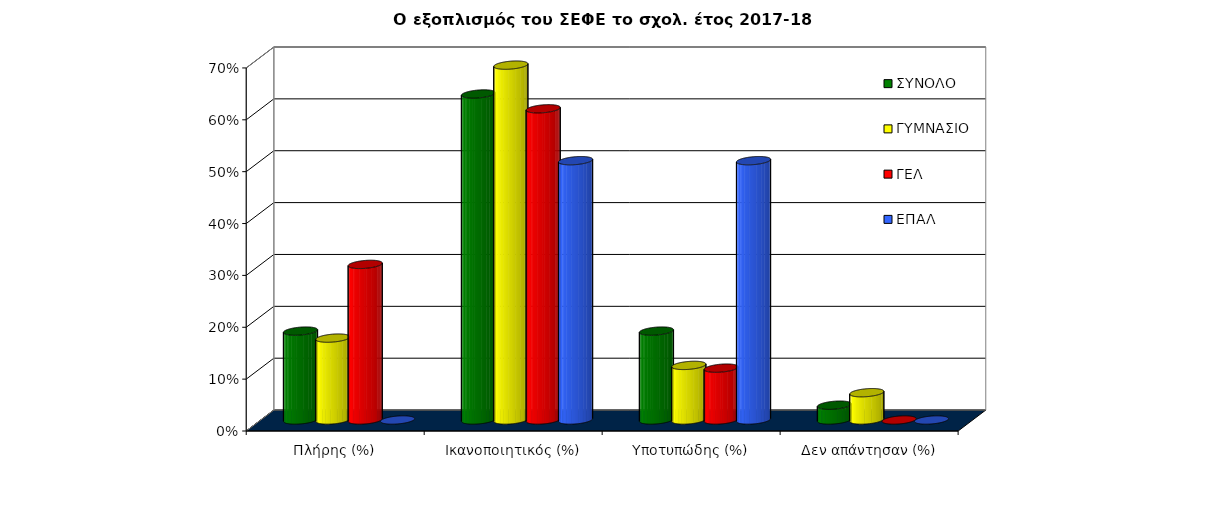
| Category | ΣΥΝΟΛΟ | ΓΥΜΝΑΣΙΟ | ΓΕΛ | ΕΠΑΛ |
|---|---|---|---|---|
| Πλήρης (%) | 0.171 | 0.158 | 0.3 | 0 |
| Ικανοποιητικός (%) | 0.629 | 0.684 | 0.6 | 0.5 |
| Υποτυπώδης (%) | 0.171 | 0.105 | 0.1 | 0.5 |
| Δεν απάντησαν (%) | 0.029 | 0.053 | 0 | 0 |